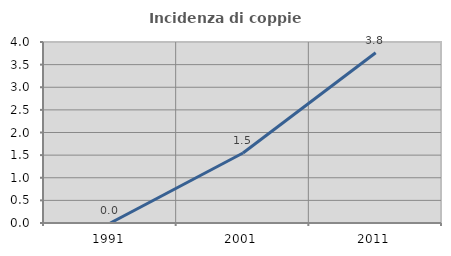
| Category | Incidenza di coppie miste |
|---|---|
| 1991.0 | 0 |
| 2001.0 | 1.546 |
| 2011.0 | 3.763 |